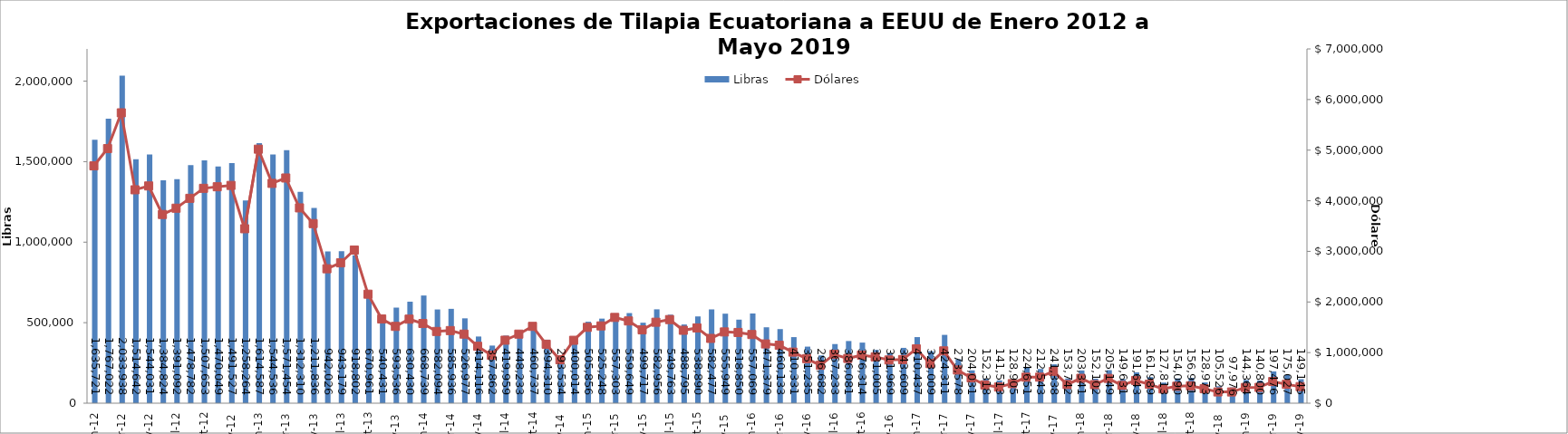
| Category | Libras  |
|---|---|
| 2012-01-01 | 1635720.607 |
| 2012-02-01 | 1767022.174 |
| 2012-03-01 | 2033937.505 |
| 2012-04-01 | 1514641.77 |
| 2012-05-01 | 1544031.293 |
| 2012-06-01 | 1384823.899 |
| 2012-07-01 | 1391091.577 |
| 2012-08-01 | 1478781.747 |
| 2012-09-01 | 1507653.188 |
| 2012-10-01 | 1470049.326 |
| 2012-11-01 | 1491526.539 |
| 2012-12-01 | 1258264 |
| 2013-01-01 | 1614587 |
| 2013-02-01 | 1544536.146 |
| 2013-03-01 | 1571454.312 |
| 2013-04-01 | 1312310.196 |
| 2013-05-01 | 1211835.551 |
| 2013-06-01 | 942025.58 |
| 2013-07-01 | 943178.586 |
| 2013-08-01 | 918802.324 |
| 2013-09-01 | 670961.192 |
| 2013-10-01 | 540431.235 |
| 2013-11-01 | 593535.64 |
| 2013-12-01 | 630429.621 |
| 2014-01-01 | 668739 |
| 2014-02-01 | 582093.766 |
| 2014-03-01 | 585936.383 |
| 2014-04-01 | 526976.561 |
| 2014-05-01 | 414116.473 |
| 2014-06-01 | 357861.695 |
| 2014-07-01 | 419958.663 |
| 2014-08-01 | 448233 |
| 2014-09-01 | 460737.149 |
| 2014-10-01 | 394310.347 |
| 2014-11-01 | 293533.672 |
| 2014-12-01 | 400013.647 |
| 2015-01-01 | 505856.493 |
| 2015-02-01 | 525248 |
| 2015-03-01 | 557303.039 |
| 2015-04-01 | 559648.733 |
| 2015-05-01 | 499716.682 |
| 2015-06-01 | 582955.764 |
| 2015-07-01 | 549763.307 |
| 2015-08-01 | 488795.094 |
| 2015-09-01 | 538890.219 |
| 2015-10-01 | 582477.366 |
| 2015-11-01 | 555949.414 |
| 2015-12-01 | 518850.405 |
| 2016-01-01 | 557069.351 |
| 2016-02-01 | 471378.754 |
| 2016-03-01 | 460133.089 |
| 2016-04-01 | 410331.175 |
| 2016-05-01 | 351235 |
| 2016-06-01 | 296682 |
| 2016-07-01 | 367233.45 |
| 2016-08-01 | 386080.575 |
| 2016-09-01 | 376314.197 |
| 2016-10-01 | 331005.258 |
| 2016-11-01 | 311968.537 |
| 2016-12-01 | 343608.956 |
| 2017-01-01 | 410436.996 |
| 2017-02-01 | 323009.174 |
| 2017-03-01 | 424310.544 |
| 2017-04-01 | 273577.632 |
| 2017-05-01 | 204031.321 |
| 2017-06-01 | 152318.019 |
| 2017-07-01 | 141513.274 |
| 2017-08-01 | 128905.167 |
| 2017-09-01 | 224650.945 |
| 2017-10-01 | 212543.281 |
| 2017-11-01 | 241337.562 |
| 2017-12-01 | 153742.19 |
| 2018-01-01 | 203341.281 |
| 2018-02-01 | 152101.968 |
| 2018-03-01 | 205149.053 |
| 2018-04-01 | 149630.611 |
| 2018-05-01 | 191643 |
| 2018-06-01 | 161989 |
| 2018-07-01 | 127813 |
| 2018-08-01 | 154089.894 |
| 2018-09-01 | 156951.494 |
| 2018-10-01 | 128972.628 |
| 2018-11-01 | 105526.466 |
| 2018-12-01 | 97975.634 |
| 2019-01-01 | 144364.157 |
| 2019-02-01 | 140800 |
| 2019-03-01 | 197476 |
| 2019-04-01 | 175027.19 |
| 2019-05-01 | 149144.92 |